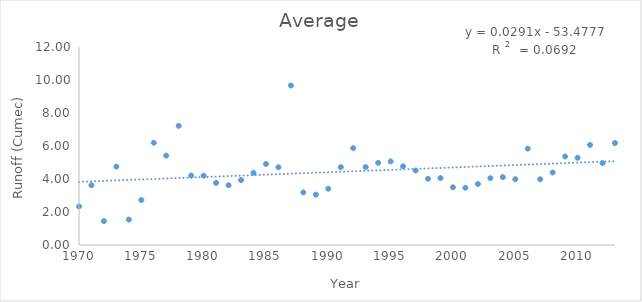
| Category | Average |
|---|---|
| 1970.0 | 2.338 |
| 1971.0 | 3.624 |
| 1972.0 | 1.448 |
| 1973.0 | 4.75 |
| 1974.0 | 1.541 |
| 1975.0 | 2.723 |
| 1976.0 | 6.195 |
| 1977.0 | 5.417 |
| 1978.0 | 7.22 |
| 1979.0 | 4.207 |
| 1980.0 | 4.204 |
| 1981.0 | 3.764 |
| 1982.0 | 3.623 |
| 1983.0 | 3.936 |
| 1984.0 | 4.379 |
| 1985.0 | 4.913 |
| 1986.0 | 4.713 |
| 1987.0 | 9.667 |
| 1988.0 | 3.186 |
| 1989.0 | 3.053 |
| 1990.0 | 3.412 |
| 1991.0 | 4.718 |
| 1992.0 | 5.867 |
| 1993.0 | 4.723 |
| 1994.0 | 4.977 |
| 1995.0 | 5.066 |
| 1996.0 | 4.767 |
| 1997.0 | 4.515 |
| 1998.0 | 4.015 |
| 1999.0 | 4.057 |
| 2000.0 | 3.497 |
| 2001.0 | 3.467 |
| 2002.0 | 3.699 |
| 2003.0 | 4.052 |
| 2004.0 | 4.116 |
| 2005.0 | 3.985 |
| 2006.0 | 5.84 |
| 2007.0 | 3.983 |
| 2008.0 | 4.393 |
| 2009.0 | 5.365 |
| 2010.0 | 5.287 |
| 2011.0 | 6.064 |
| 2012.0 | 4.964 |
| 2013.0 | 6.18 |